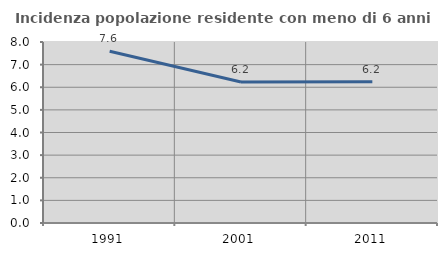
| Category | Incidenza popolazione residente con meno di 6 anni |
|---|---|
| 1991.0 | 7.588 |
| 2001.0 | 6.235 |
| 2011.0 | 6.246 |